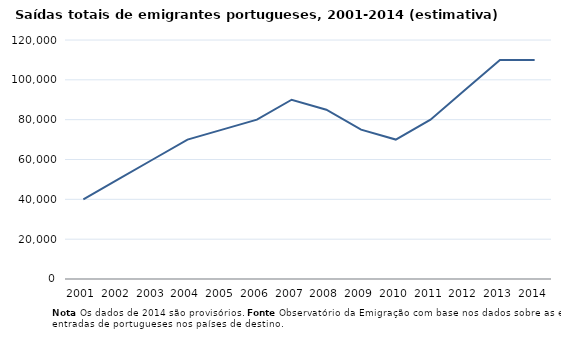
| Category | Saidas |
|---|---|
| 2001.0 | 40000 |
| 2002.0 | 50000 |
| 2003.0 | 60000 |
| 2004.0 | 70000 |
| 2005.0 | 75000 |
| 2006.0 | 80000 |
| 2007.0 | 90000 |
| 2008.0 | 85000 |
| 2009.0 | 75000 |
| 2010.0 | 70000 |
| 2011.0 | 80000 |
| 2012.0 | 95000 |
| 2013.0 | 110000 |
| 2014.0 | 110000 |